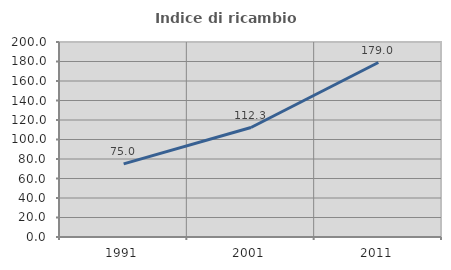
| Category | Indice di ricambio occupazionale  |
|---|---|
| 1991.0 | 75 |
| 2001.0 | 112.273 |
| 2011.0 | 178.974 |